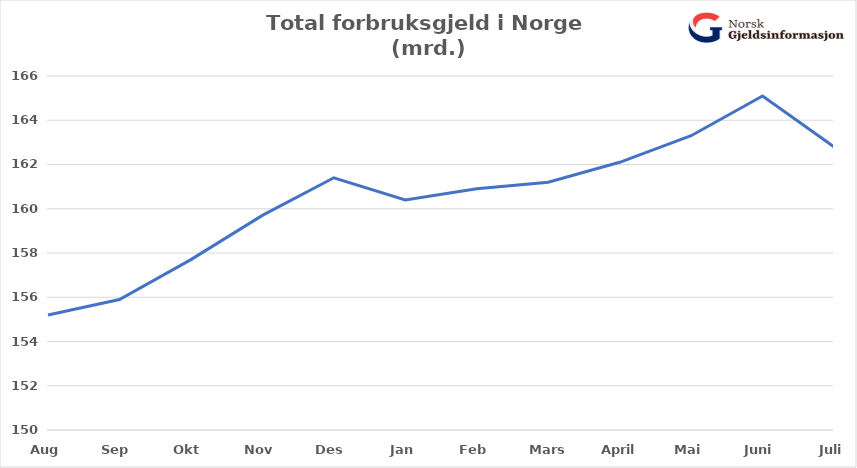
| Category | Total usikret gjeld (mrd) |
|---|---|
| Aug | 155.2 |
| Sep | 155.9 |
| Okt | 157.7 |
| Nov | 159.7 |
| Des | 161.4 |
| Jan | 160.4 |
| Feb | 160.9 |
| Mars | 161.2 |
| April | 162.1 |
| Mai | 163.3 |
| Juni | 165.1 |
| Juli | 162.8 |